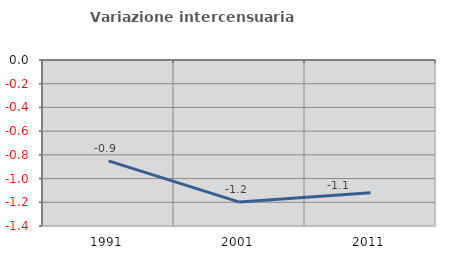
| Category | Variazione intercensuaria annua |
|---|---|
| 1991.0 | -0.85 |
| 2001.0 | -1.198 |
| 2011.0 | -1.119 |